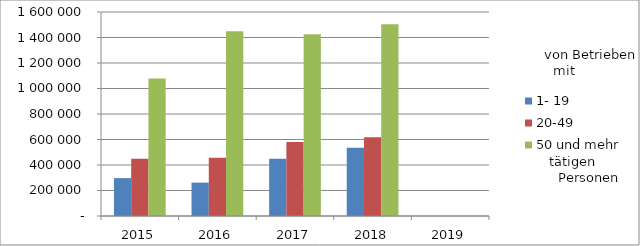
| Category | 1- 19 | 20-49 | 50 und mehr |
|---|---|---|---|
| 2015.0 | 297116.655 | 448998.512 | 1078892.853 |
| 2016.0 | 261822.605 | 456254.347 | 1449929.516 |
| 2017.0 | 449238.155 | 579413.351 | 1425932.487 |
| 2018.0 | 536024.379 | 617872.882 | 1504659.932 |
| 2019.0 | 0 | 0 | 0 |